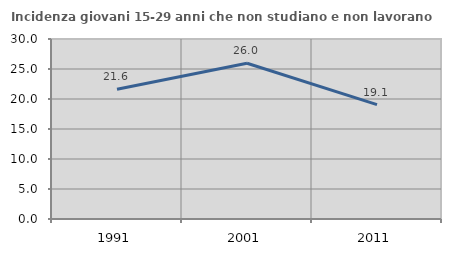
| Category | Incidenza giovani 15-29 anni che non studiano e non lavorano  |
|---|---|
| 1991.0 | 21.628 |
| 2001.0 | 25.963 |
| 2011.0 | 19.068 |